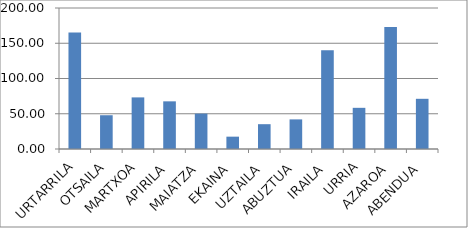
| Category | Series 0 |
|---|---|
| URTARRILA | 165.3 |
| OTSAILA | 47.9 |
| MARTXOA | 73.2 |
| APIRILA | 67.6 |
| MAIATZA | 50.2 |
| EKAINA | 17.5 |
| UZTAILA | 35.2 |
| ABUZTUA | 42 |
| IRAILA | 140.2 |
| URRIA | 58.4 |
| AZAROA | 173 |
| ABENDUA | 71.2 |